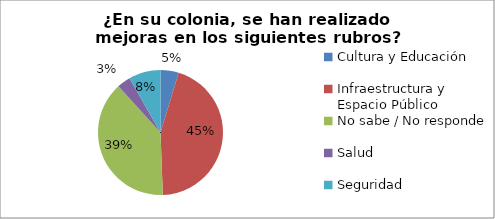
| Category | Series 0 |
|---|---|
| Cultura y Educación  | 0.047 |
| Infraestructura y Espacio Público | 0.447 |
| No sabe / No responde | 0.388 |
| Salud | 0.035 |
| Seguridad  | 0.082 |